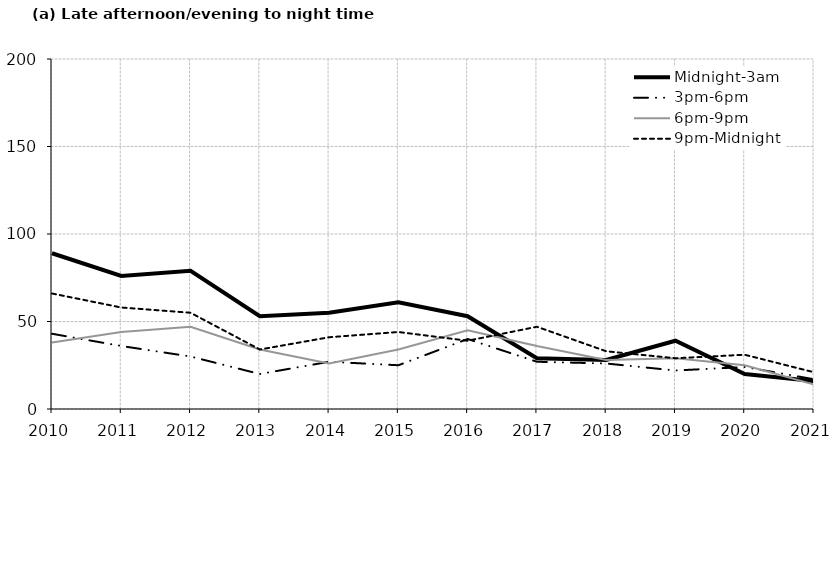
| Category | Midnight-3am | 3pm-6pm | 6pm-9pm | 9pm-Midnight |
|---|---|---|---|---|
| 2010.0 | 89 | 43 | 38 | 66 |
| 2011.0 | 76 | 36 | 44 | 58 |
| 2012.0 | 79 | 30 | 47 | 55 |
| 2013.0 | 53 | 20 | 34 | 34 |
| 2014.0 | 55 | 27 | 26 | 41 |
| 2015.0 | 61 | 25 | 34 | 44 |
| 2016.0 | 53 | 40 | 45 | 39 |
| 2017.0 | 29 | 27 | 36 | 47 |
| 2018.0 | 28 | 26 | 28 | 33 |
| 2019.0 | 39 | 22 | 29 | 29 |
| 2020.0 | 20 | 24 | 25 | 31 |
| 2021.0 | 16 | 17 | 14 | 21 |